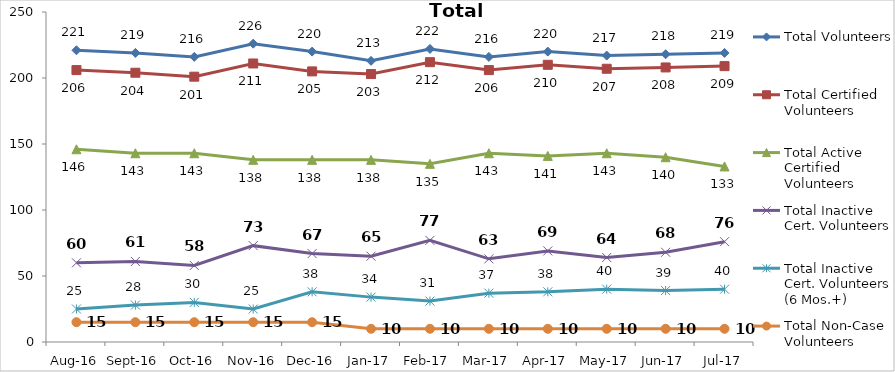
| Category | Total Volunteers | Total Certified Volunteers | Total Active Certified Volunteers | Total Inactive Cert. Volunteers | Total Inactive Cert. Volunteers (6 Mos.+) | Total Non-Case Volunteers |
|---|---|---|---|---|---|---|
| Aug-16 | 221 | 206 | 146 | 60 | 25 | 15 |
| Sep-16 | 219 | 204 | 143 | 61 | 28 | 15 |
| Oct-16 | 216 | 201 | 143 | 58 | 30 | 15 |
| Nov-16 | 226 | 211 | 138 | 73 | 25 | 15 |
| Dec-16 | 220 | 205 | 138 | 67 | 38 | 15 |
| Jan-17 | 213 | 203 | 138 | 65 | 34 | 10 |
| Feb-17 | 222 | 212 | 135 | 77 | 31 | 10 |
| Mar-17 | 216 | 206 | 143 | 63 | 37 | 10 |
| Apr-17 | 220 | 210 | 141 | 69 | 38 | 10 |
| May-17 | 217 | 207 | 143 | 64 | 40 | 10 |
| Jun-17 | 218 | 208 | 140 | 68 | 39 | 10 |
| Jul-17 | 219 | 209 | 133 | 76 | 40 | 10 |